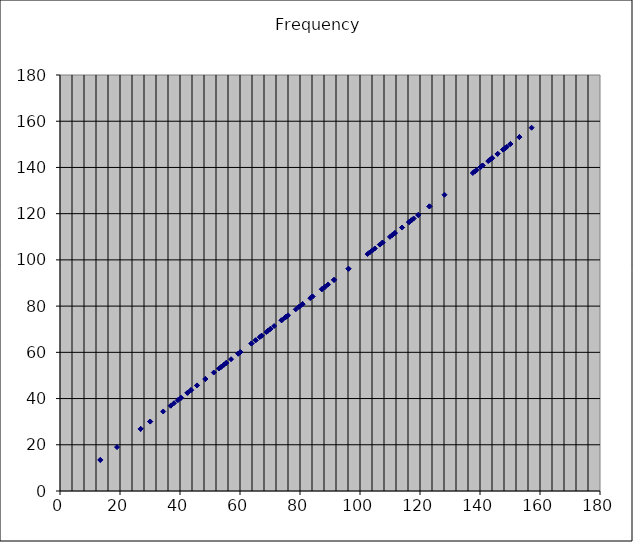
| Category | Frequency |
|---|---|
| 34.4 | 34.4 |
| 68.8 | 68.8 |
| 103.2 | 103.2 |
| 137.6 | 137.6 |
| 13.4375 | 13.438 |
| 36.93137428054905 | 36.931 |
| 70.09997436697107 | 70.1 |
| 104.07116030029644 | 104.071 |
| 138.25457101394517 | 138.255 |
| 26.875 | 26.875 |
| 43.65347208413095 | 43.653 |
| 73.8627485610981 | 73.863 |
| 106.6419505869993 | 106.642 |
| 140.19994873394214 | 140.2 |
| 40.3125 | 40.312 |
| 52.99488330254158 | 52.995 |
| 79.74043927801 | 79.74 |
| 110.79412284164717 | 110.794 |
| 143.38360316385553 | 143.384 |
| 53.75 | 53.75 |
| 63.815534942520074 | 63.816 |
| 87.3069441682619 | 87.307 |
| 116.35850849851936 | 116.359 |
| 147.7254971221962 | 147.725 |
| 13.4375 | 13.438 |
| 36.93137428054905 | 36.931 |
| 70.09997436697107 | 70.1 |
| 104.07116030029644 | 104.071 |
| 138.25457101394517 | 138.255 |
| 19.003494744388465 | 19.003 |
| 39.30003578242646 | 39.3 |
| 71.37627625829188 | 71.376 |
| 104.9350885666944 | 104.935 |
| 138.9060575083031 | 138.906 |
| 30.047163447653425 | 30.047 |
| 45.67485119023378 | 45.675 |
| 75.07510926565476 | 75.075 |
| 107.4852177336493 | 107.485 |
| 140.84243689758426 | 140.842 |
| 42.493106058512595 | 42.493 |
| 54.67196779429107 | 54.672 |
| 80.86472693640906 | 80.865 |
| 111.60602162293934 | 111.606 |
| 144.01188861514177 | 144.012 |
| 55.404231844237316 | 55.404 |
| 65.21494388750173 | 65.215 |
| 88.33498121497509 | 88.335 |
| 117.13184411700347 | 117.132 |
| 148.33539330264372 | 148.335 |
| 26.875 | 26.875 |
| 43.65347208413095 | 43.653 |
| 73.8627485610981 | 73.863 |
| 106.6419505869993 | 106.642 |
| 140.19994873394214 | 140.2 |
| 30.047163447653425 | 30.047 |
| 45.67485119023378 | 45.675 |
| 75.07510926565476 | 75.075 |
| 107.4852177336493 | 107.485 |
| 140.84243689758426 | 140.842 |
| 38.00698948877693 | 38.007 |
| 51.262961775535366 | 51.263 |
| 78.60007156485293 | 78.6 |
| 109.9762303863885 | 109.976 |
| 142.75255251658376 | 142.753 |
| 48.44959526404735 | 48.45 |
| 59.419889609877266 | 59.42 |
| 84.14750906146897 | 84.148 |
| 114.0070317184427 | 114.007 |
| 145.88051028581577 | 145.881 |
| 60.09432689530685 | 60.094 |
| 69.24368653530804 | 69.244 |
| 91.34970238046756 | 91.35 |
| 119.42180757717578 | 119.422 |
| 150.15021853130952 | 150.15 |
| 40.3125 | 40.312 |
| 52.99488330254158 | 52.995 |
| 79.74043927801 | 79.74 |
| 110.79412284164717 | 110.794 |
| 143.38360316385553 | 143.384 |
| 42.493106058512595 | 42.493 |
| 54.67196779429107 | 54.672 |
| 80.86472693640906 | 80.865 |
| 111.60602162293934 | 111.606 |
| 144.01188861514177 | 144.012 |
| 48.44959526404735 | 48.45 |
| 59.419889609877266 | 59.42 |
| 84.14750906146897 | 84.148 |
| 114.0070317184427 | 114.007 |
| 145.88051028581577 | 145.881 |
| 57.0104842331654 | 57.01 |
| 66.58494809264327 | 66.585 |
| 89.35119088462112 | 89.351 |
| 117.90010734727937 | 117.9 |
| 148.94279207971096 | 148.943 |
| 67.1875 | 67.188 |
| 75.48191939961517 | 75.482 |
| 96.16444330546504 | 96.164 |
| 123.14381899328119 | 123.144 |
| 153.12713722998288 | 153.127 |
| 53.75 | 53.75 |
| 63.815534942520074 | 63.816 |
| 87.3069441682619 | 87.307 |
| 116.35850849851936 | 116.359 |
| 147.7254971221962 | 147.725 |
| 55.404231844237316 | 55.404 |
| 65.21494388750173 | 65.215 |
| 88.33498121497509 | 88.335 |
| 117.13184411700347 | 117.132 |
| 148.33539330264372 | 148.335 |
| 60.09432689530685 | 60.094 |
| 69.24368653530804 | 69.244 |
| 91.34970238046756 | 91.35 |
| 119.42180757717578 | 119.422 |
| 150.15021853130952 | 150.15 |
| 67.1875 | 67.188 |
| 75.48191939961517 | 75.482 |
| 96.16444330546504 | 96.164 |
| 123.14381899328119 | 123.144 |
| 153.12713722998288 | 153.127 |
| 76.01397897755386 | 76.014 |
| 83.43551402130869 | 83.436 |
| 102.52592355107073 | 102.526 |
| 128.17318362278436 | 128.173 |
| 157.20014312970585 | 157.2 |